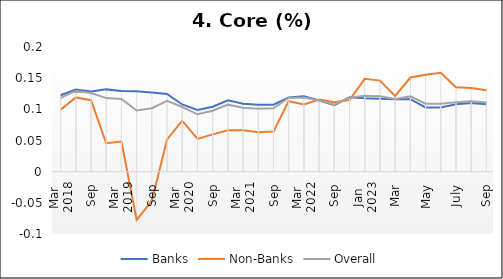
| Category | Banks | Non-Banks | Overall |
|---|---|---|---|
| 0 | 0.123 | 0.099 | 0.118 |
| 1 | 0.132 | 0.119 | 0.13 |
| 2 | 0.128 | 0.115 | 0.126 |
| 3 | 0.132 | 0.046 | 0.118 |
| 4 | 0.13 | 0.048 | 0.117 |
| 5 | 0.129 | -0.077 | 0.098 |
| 6 | 0.127 | -0.047 | 0.102 |
| 7 | 0.125 | 0.052 | 0.114 |
| 8 | 0.108 | 0.082 | 0.104 |
| 9 | 0.099 | 0.053 | 0.092 |
| 10 | 0.104 | 0.06 | 0.098 |
| 11 | 0.114 | 0.066 | 0.108 |
| 12 | 0.109 | 0.066 | 0.102 |
| 13 | 0.107 | 0.063 | 0.101 |
| 14 | 0.108 | 0.064 | 0.102 |
| 15 | 0.119 | 0.113 | 0.118 |
| 16 | 0.121 | 0.108 | 0.119 |
| 17 | 0.114 | 0.116 | 0.114 |
| 18 | 0.107 | 0.111 | 0.107 |
| 19 | 0.119 | 0.115 | 0.119 |
| 20 | 0.118 | 0.149 | 0.122 |
| 21 | 0.117 | 0.146 | 0.121 |
| 22 | 0.116 | 0.122 | 0.117 |
| 23 | 0.116 | 0.151 | 0.121 |
| 24 | 0.103 | 0.156 | 0.109 |
| 25 | 0.103 | 0.159 | 0.109 |
| 26 | 0.108 | 0.135 | 0.111 |
| 27 | 0.11 | 0.134 | 0.113 |
| 28 | 0.108 | 0.131 | 0.111 |